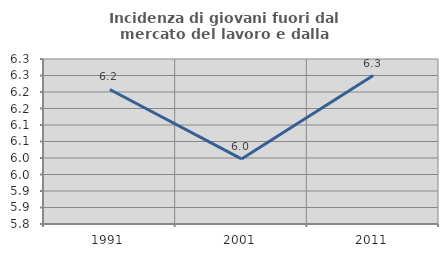
| Category | Incidenza di giovani fuori dal mercato del lavoro e dalla formazione  |
|---|---|
| 1991.0 | 6.208 |
| 2001.0 | 5.997 |
| 2011.0 | 6.25 |